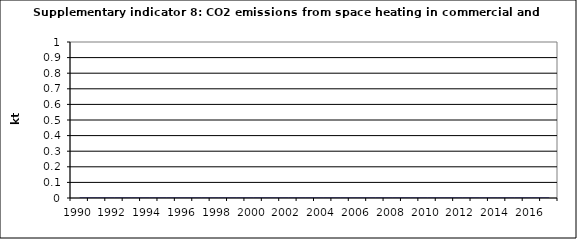
| Category | CO2 emissions from space heating in commercial and institutional, kt |
|---|---|
| 1990 | 0 |
| 1991 | 0 |
| 1992 | 0 |
| 1993 | 0 |
| 1994 | 0 |
| 1995 | 0 |
| 1996 | 0 |
| 1997 | 0 |
| 1998 | 0 |
| 1999 | 0 |
| 2000 | 0 |
| 2001 | 0 |
| 2002 | 0 |
| 2003 | 0 |
| 2004 | 0 |
| 2005 | 0 |
| 2006 | 0 |
| 2007 | 0 |
| 2008 | 0 |
| 2009 | 0 |
| 2010 | 0 |
| 2011 | 0 |
| 2012 | 0 |
| 2013 | 0 |
| 2014 | 0 |
| 2015 | 0 |
| 2016 | 0 |
| 2017 | 0 |